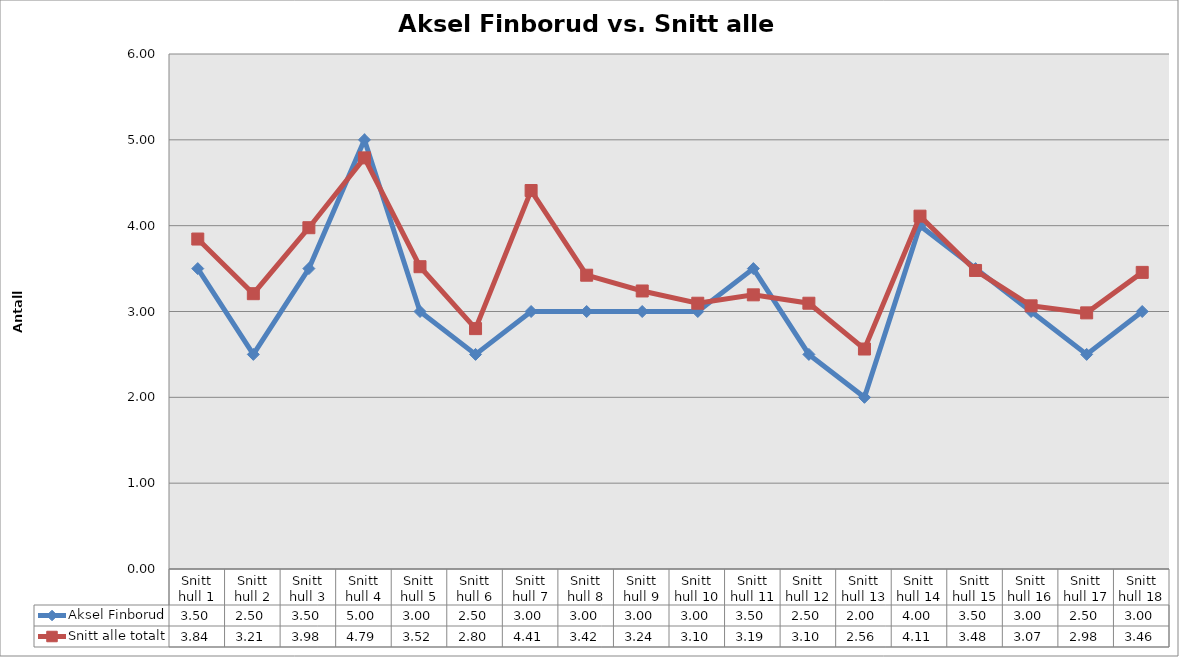
| Category | Aksel Finborud | Snitt alle totalt |
|---|---|---|
| Snitt hull 1 | 3.5 | 3.844 |
| Snitt hull 2 | 2.5 | 3.207 |
| Snitt hull 3 | 3.5 | 3.976 |
| Snitt hull 4 | 5 | 4.79 |
| Snitt hull 5 | 3 | 3.522 |
| Snitt hull 6 | 2.5 | 2.801 |
| Snitt hull 7 | 3 | 4.41 |
| Snitt hull 8 | 3 | 3.423 |
| Snitt hull 9 | 3 | 3.239 |
| Snitt hull 10 | 3 | 3.096 |
| Snitt hull 11 | 3.5 | 3.194 |
| Snitt hull 12 | 2.5 | 3.096 |
| Snitt hull 13 | 2 | 2.563 |
| Snitt hull 14 | 4 | 4.111 |
| Snitt hull 15 | 3.5 | 3.478 |
| Snitt hull 16 | 3 | 3.066 |
| Snitt hull 17 | 2.5 | 2.984 |
| Snitt hull 18 | 3 | 3.456 |